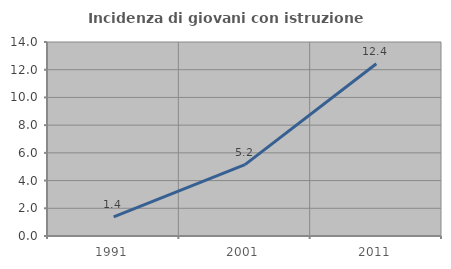
| Category | Incidenza di giovani con istruzione universitaria |
|---|---|
| 1991.0 | 1.375 |
| 2001.0 | 5.151 |
| 2011.0 | 12.427 |